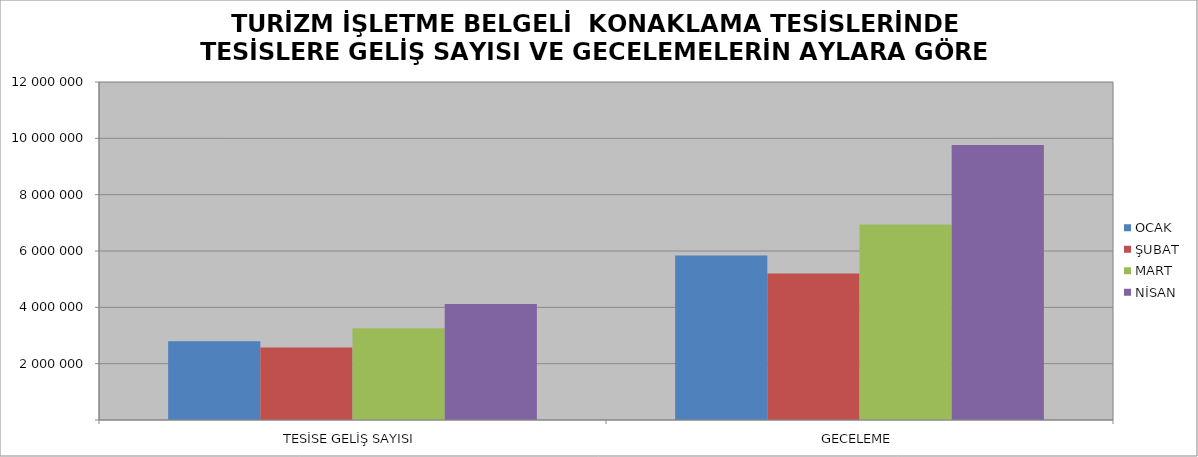
| Category | OCAK | ŞUBAT | MART | NİSAN |
|---|---|---|---|---|
| TESİSE GELİŞ SAYISI | 2792196 | 2573999 | 3258929 | 4119434 |
| GECELEME | 5837753 | 5199578 | 6939659 | 9767435 |